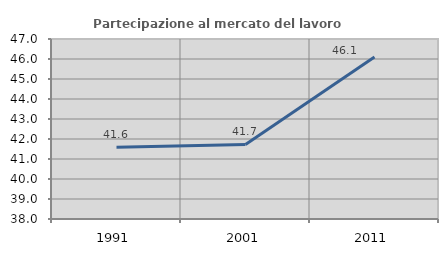
| Category | Partecipazione al mercato del lavoro  femminile |
|---|---|
| 1991.0 | 41.593 |
| 2001.0 | 41.73 |
| 2011.0 | 46.098 |